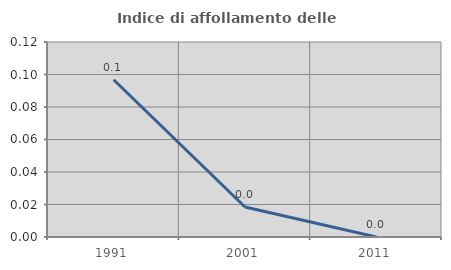
| Category | Indice di affollamento delle abitazioni  |
|---|---|
| 1991.0 | 0.097 |
| 2001.0 | 0.018 |
| 2011.0 | 0 |